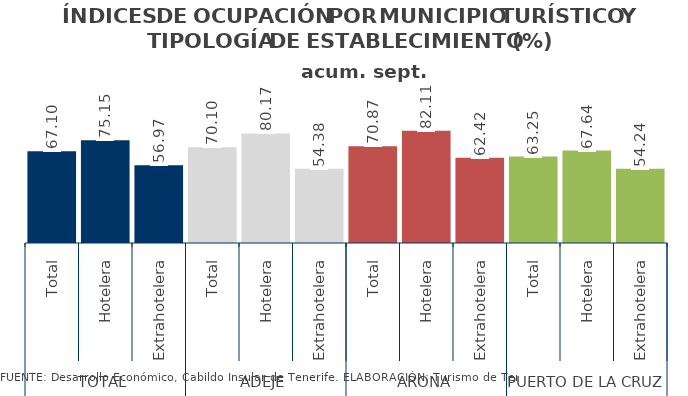
| Category | acum. sept. 2014 |
|---|---|
| 0 | 67.104 |
| 1 | 75.15 |
| 2 | 56.973 |
| 3 | 70.102 |
| 4 | 80.173 |
| 5 | 54.384 |
| 6 | 70.868 |
| 7 | 82.108 |
| 8 | 62.421 |
| 9 | 63.254 |
| 10 | 67.637 |
| 11 | 54.244 |